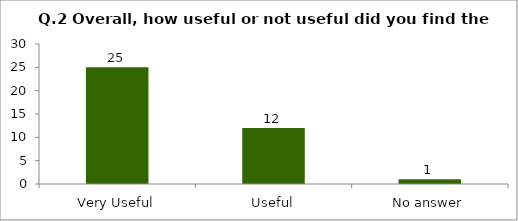
| Category | Q.2 Overall, how useful or not useful did you find the Session? |
|---|---|
| Very Useful | 25 |
| Useful | 12 |
| No answer | 1 |